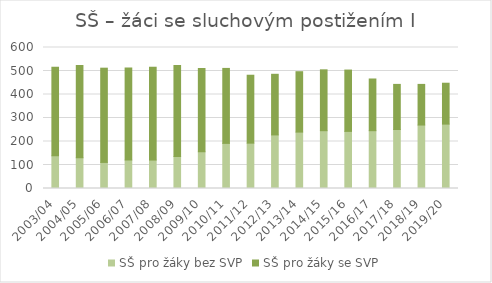
| Category | SŠ pro žáky bez SVP | SŠ pro žáky se SVP |
|---|---|---|
| 2003/04 | 139 | 377 |
| 2004/05 | 131 | 392 |
| 2005/06 | 111 | 401 |
| 2006/07 | 121 | 392 |
| 2007/08 | 121 | 395 |
| 2008/09 | 136 | 387 |
| 2009/10 | 156 | 355 |
| 2010/11 | 192 | 319 |
| 2011/12 | 193 | 289 |
| 2012/13 | 228 | 258 |
| 2013/14 | 240 | 257 |
| 2014/15 | 246 | 259 |
| 2015/16 | 243 | 261 |
| 2016/17 | 246 | 220 |
| 2017/18 | 251 | 192 |
| 2018/19 | 270 | 173 |
| 2019/20 | 274 | 174 |